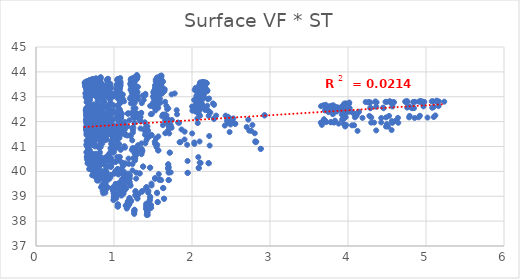
| Category | UTCI |
|---|---|
| 4.486788539 | 41.801 |
| 3.949624654 | 42.354 |
| 3.759180136 | 42.436 |
| 3.742222567 | 42.552 |
| 3.654237098 | 42.621 |
| 3.974717196 | 42.715 |
| 4.263869113 | 42.77 |
| 4.542926614 | 42.775 |
| 4.744093994 | 42.787 |
| 4.940980931 | 42.786 |
| 5.135739082 | 42.8 |
| 2.879706771 | 40.906 |
| 2.552333557 | 41.915 |
| 2.279948675 | 42.115 |
| 2.177338971 | 42.474 |
| 2.061597244 | 42.911 |
| 2.094749023 | 43.022 |
| 2.126837848 | 43.104 |
| 2.15227498 | 43.135 |
| 2.153879629 | 43.232 |
| 2.194003849 | 43.233 |
| 2.19378923 | 43.259 |
| 2.210856108 | 40.328 |
| 2.029364198 | 41.163 |
| 1.73897898 | 41.752 |
| 1.673625694 | 42.249 |
| 1.564835136 | 42.954 |
| 1.572547364 | 43.087 |
| 1.535855934 | 43.181 |
| 1.60111586 | 43.562 |
| 1.582209392 | 43.586 |
| 1.623315371 | 43.605 |
| 1.613406965 | 43.638 |
| 1.942210423 | 39.941 |
| 1.714235102 | 40.753 |
| 1.480953412 | 41.462 |
| 1.4254869 | 41.677 |
| 1.294508838 | 42.173 |
| 1.271420072 | 42.326 |
| 1.253394651 | 42.743 |
| 1.270340444 | 43.111 |
| 1.278923387 | 43.162 |
| 1.283626095 | 43.194 |
| 1.30296399 | 43.397 |
| 1.698177774 | 39.65 |
| 1.462028367 | 40.148 |
| 1.27091445 | 40.839 |
| 1.201809311 | 41.442 |
| 1.10058555 | 41.636 |
| 1.075263798 | 41.829 |
| 1.052933975 | 42.291 |
| 1.078854567 | 42.379 |
| 1.072377857 | 42.444 |
| 1.08537817 | 42.779 |
| 1.080415606 | 43.118 |
| 1.639682546 | 38.899 |
| 1.327794919 | 39.919 |
| 1.141592862 | 40.321 |
| 1.075417488 | 40.58 |
| 0.997992097 | 41.447 |
| 0.946364996 | 41.664 |
| 0.935350475 | 41.808 |
| 0.94243079 | 42.223 |
| 0.942487908 | 42.318 |
| 0.951610133 | 42.383 |
| 0.957651434 | 42.71 |
| 1.55863117 | 38.765 |
| 1.209449999 | 39.451 |
| 1.046748924 | 40.1 |
| 0.995684676 | 40.396 |
| 0.907667708 | 41.278 |
| 0.874918428 | 41.495 |
| 0.845177183 | 41.667 |
| 0.859620747 | 41.762 |
| 0.854211444 | 42.188 |
| 0.855205171 | 42.239 |
| 0.860226385 | 42.303 |
| 1.4701185 | 38.645 |
| 1.150492305 | 39.325 |
| 1.003495515 | 39.914 |
| 0.927974144 | 40.198 |
| 0.859902124 | 40.457 |
| 0.806846385 | 41.036 |
| 0.795131838 | 41.522 |
| 0.789590195 | 41.642 |
| 0.796087293 | 41.741 |
| 0.790709972 | 41.837 |
| 0.799640608 | 42.202 |
| 1.470584202 | 38.536 |
| 1.118441243 | 39.177 |
| 0.949479058 | 39.746 |
| 0.885737589 | 40.015 |
| 0.812335912 | 40.269 |
| 0.74869555 | 40.516 |
| 0.745889614 | 41.062 |
| 0.738537897 | 41.508 |
| 0.744077679 | 41.613 |
| 0.737655734 | 41.707 |
| 0.746270365 | 41.798 |
| 1.42519891 | 38.405 |
| 1.092816643 | 39.055 |
| 0.91536853 | 39.37 |
| 0.855506337 | 39.889 |
| 0.772737936 | 40.124 |
| 0.72681758 | 40.391 |
| 0.708651987 | 40.571 |
| 0.707507181 | 41.369 |
| 0.70383044 | 41.492 |
| 0.6982605 | 41.584 |
| 0.702827981 | 41.675 |
| 1.422681307 | 38.334 |
| 1.046331424 | 38.674 |
| 0.890908404 | 39.249 |
| 0.819866809 | 39.739 |
| 0.751866019 | 39.994 |
| 0.700565779 | 40.232 |
| 0.682326836 | 40.455 |
| 0.679053208 | 40.588 |
| 0.674430372 | 41.375 |
| 0.672207809 | 41.482 |
| 0.674028473 | 41.572 |
| 1.419907324 | 38.247 |
| 1.044553532 | 38.587 |
| 0.889438845 | 39.146 |
| 0.804589099 | 39.629 |
| 0.735897723 | 39.843 |
| 0.681566753 | 40.092 |
| 0.660359029 | 40.321 |
| 0.652663117 | 40.488 |
| 0.650654639 | 40.587 |
| 0.64479603 | 41.068 |
| 0.646346839 | 41.473 |
| 4.568565884 | 41.948 |
| 4.140984143 | 42.397 |
| 3.951257644 | 42.508 |
| 3.863094755 | 42.576 |
| 3.92836058 | 42.635 |
| 3.975672008 | 42.716 |
| 4.357384298 | 42.768 |
| 4.590170348 | 42.78 |
| 4.834905093 | 42.79 |
| 4.978555975 | 42.791 |
| 5.234250516 | 42.802 |
| 2.823903527 | 41.188 |
| 2.494266268 | 41.885 |
| 2.223392308 | 42.396 |
| 2.133300163 | 42.662 |
| 2.08761835 | 43.052 |
| 2.060211047 | 43.035 |
| 2.098200008 | 43.461 |
| 2.133390441 | 43.497 |
| 2.136926267 | 43.513 |
| 2.16177453 | 43.521 |
| 2.172496844 | 43.545 |
| 2.110966983 | 40.34 |
| 1.851264698 | 41.174 |
| 1.69276654 | 42.086 |
| 1.625501071 | 42.274 |
| 1.563154578 | 42.68 |
| 1.519896174 | 43.098 |
| 1.531501775 | 43.359 |
| 1.568305052 | 43.41 |
| 1.592444457 | 43.597 |
| 1.596414871 | 43.621 |
| 1.615301887 | 43.643 |
| 1.726968067 | 39.96 |
| 1.570120589 | 40.841 |
| 1.397507061 | 41.474 |
| 1.337292328 | 42.02 |
| 1.280268519 | 42.2 |
| 1.228640717 | 42.35 |
| 1.229067227 | 42.751 |
| 1.241658919 | 43.114 |
| 1.261871118 | 43.17 |
| 1.258357699 | 43.367 |
| 1.284956586 | 43.401 |
| 1.605386565 | 39.649 |
| 1.374324453 | 40.188 |
| 1.228672293 | 40.866 |
| 1.150817173 | 41.471 |
| 1.110639825 | 41.679 |
| 1.04946705 | 42.147 |
| 1.04817008 | 42.301 |
| 1.062960038 | 42.398 |
| 1.071685389 | 42.733 |
| 1.072417287 | 43.085 |
| 1.079581495 | 43.136 |
| 1.43789417 | 39.145 |
| 1.285693402 | 39.947 |
| 1.103919447 | 40.329 |
| 1.023459191 | 41.274 |
| 0.992571992 | 41.482 |
| 0.920358685 | 41.686 |
| 0.924444893 | 41.832 |
| 0.920446597 | 42.239 |
| 0.93499502 | 42.327 |
| 0.933088916 | 42.399 |
| 0.94913168 | 42.72 |
| 1.301296136 | 39.038 |
| 1.126944807 | 39.991 |
| 1.016885737 | 40.379 |
| 0.934808721 | 40.681 |
| 0.897109835 | 41.594 |
| 0.840205139 | 41.78 |
| 0.836574405 | 41.959 |
| 0.833480858 | 42.36 |
| 0.844733901 | 42.46 |
| 0.836333877 | 42.519 |
| 0.852197248 | 42.605 |
| 1.299932386 | 38.906 |
| 1.099698081 | 39.582 |
| 0.958620356 | 40.195 |
| 0.887012653 | 40.5 |
| 0.85049672 | 41.117 |
| 0.782081688 | 41.335 |
| 0.784620905 | 41.808 |
| 0.768010044 | 41.928 |
| 0.787885724 | 42.032 |
| 0.775012112 | 42.427 |
| 0.791110925 | 42.495 |
| 1.216596783 | 38.804 |
| 1.072606 | 39.436 |
| 0.911021567 | 39.756 |
| 0.85100343 | 40.31 |
| 0.803995514 | 40.595 |
| 0.739806421 | 41.162 |
| 0.739887353 | 41.361 |
| 0.729963395 | 41.791 |
| 0.739078206 | 41.89 |
| 0.733108039 | 41.994 |
| 0.741933057 | 42.091 |
| 1.192847794 | 38.681 |
| 1.034547222 | 39.056 |
| 0.885436112 | 39.596 |
| 0.807866346 | 40.187 |
| 0.780377973 | 40.439 |
| 0.707279935 | 40.664 |
| 0.707602419 | 41.221 |
| 0.694819785 | 41.661 |
| 0.701880716 | 41.773 |
| 0.694781085 | 41.877 |
| 0.704588817 | 41.974 |
| 1.178879667 | 38.605 |
| 0.9966227 | 38.942 |
| 0.864012081 | 39.472 |
| 0.791393328 | 40.037 |
| 0.756858921 | 40.297 |
| 0.689126227 | 40.518 |
| 0.678822456 | 40.727 |
| 0.667479713 | 40.874 |
| 0.671936342 | 41.66 |
| 0.667517162 | 41.768 |
| 0.672772356 | 41.874 |
| 1.163297432 | 38.505 |
| 0.991924402 | 38.845 |
| 0.844136305 | 39.38 |
| 0.772680061 | 39.916 |
| 0.732469704 | 40.168 |
| 0.665948811 | 40.366 |
| 0.656651714 | 40.599 |
| 0.646180819 | 40.763 |
| 0.648423331 | 41.234 |
| 0.641929459 | 41.659 |
| 0.643663169 | 41.762 |
| 4.334167833 | 41.962 |
| 4.088981611 | 42.174 |
| 3.839176386 | 42.522 |
| 3.750908166 | 42.381 |
| 3.812900498 | 42.655 |
| 3.952248714 | 42.726 |
| 4.226309921 | 42.787 |
| 4.496298362 | 42.792 |
| 4.733871726 | 42.803 |
| 4.914619919 | 42.805 |
| 5.07323341 | 42.815 |
| 2.804915347 | 41.531 |
| 2.457060372 | 41.976 |
| 2.27697354 | 42.713 |
| 2.123249963 | 42.971 |
| 2.093839693 | 43.244 |
| 2.09248676 | 43.341 |
| 2.096968671 | 43.494 |
| 2.155295311 | 43.517 |
| 2.155420455 | 43.533 |
| 2.186201903 | 43.545 |
| 2.176563232 | 43.569 |
| 2.084443954 | 40.141 |
| 1.906263649 | 41.595 |
| 1.726687763 | 41.862 |
| 1.657175268 | 42.054 |
| 1.560880592 | 42.767 |
| 1.550719953 | 42.871 |
| 1.541393061 | 43.137 |
| 1.587143675 | 43.338 |
| 1.614314925 | 43.366 |
| 1.602933173 | 43.383 |
| 1.607141172 | 43.482 |
| 1.694931019 | 40.286 |
| 1.524894866 | 41.111 |
| 1.428590405 | 41.81 |
| 1.347970966 | 42.347 |
| 1.275890454 | 42.537 |
| 1.242623511 | 42.97 |
| 1.231375082 | 43.374 |
| 1.252636726 | 43.588 |
| 1.269865016 | 43.648 |
| 1.273066627 | 43.69 |
| 1.293620412 | 43.714 |
| 1.526039393 | 39.702 |
| 1.358705123 | 40.81 |
| 1.242169898 | 41.56 |
| 1.166178348 | 41.809 |
| 1.102118794 | 42.312 |
| 1.05598475 | 42.487 |
| 1.040386512 | 42.631 |
| 1.06758911 | 43.302 |
| 1.074224069 | 43.363 |
| 1.071277823 | 43.401 |
| 1.083064833 | 43.613 |
| 1.481829164 | 39.431 |
| 1.237078429 | 40.292 |
| 1.142213202 | 40.956 |
| 1.026915949 | 41.61 |
| 1.003493403 | 41.827 |
| 0.925847744 | 42.321 |
| 0.938169316 | 42.483 |
| 0.922478139 | 42.572 |
| 0.934407789 | 42.646 |
| 0.934592263 | 43.023 |
| 0.957231549 | 43.355 |
| 1.413353609 | 39.301 |
| 1.138222679 | 39.8 |
| 1.070738208 | 40.433 |
| 0.957307134 | 40.777 |
| 0.916056967 | 41.662 |
| 0.865359981 | 42.171 |
| 0.848137091 | 42.032 |
| 0.856355194 | 42.435 |
| 0.852054575 | 42.532 |
| 0.853728425 | 42.595 |
| 0.86821733 | 42.659 |
| 1.357551026 | 39.176 |
| 1.103368646 | 39.903 |
| 1.024503149 | 39.999 |
| 0.900406699 | 40.573 |
| 0.880290428 | 41.495 |
| 0.801954194 | 41.713 |
| 0.796576883 | 41.898 |
| 0.789835199 | 42.301 |
| 0.796134453 | 42.41 |
| 0.793672452 | 42.505 |
| 0.804287358 | 42.565 |
| 1.307206942 | 39.07 |
| 1.06884836 | 39.46 |
| 0.962689607 | 39.838 |
| 0.853005522 | 40.377 |
| 0.829119731 | 40.978 |
| 0.741542509 | 41.253 |
| 0.743493673 | 41.745 |
| 0.737922444 | 41.876 |
| 0.740542093 | 42.277 |
| 0.742027363 | 42.374 |
| 0.752166628 | 42.482 |
| 1.262807874 | 38.455 |
| 1.022385499 | 39.347 |
| 0.930858561 | 39.673 |
| 0.822914565 | 40.279 |
| 0.795722168 | 40.519 |
| 0.718964895 | 41.066 |
| 0.71320036 | 41.319 |
| 0.711544136 | 41.749 |
| 0.699479757 | 41.855 |
| 0.710435086 | 41.949 |
| 0.712502063 | 42.358 |
| 1.259869452 | 38.386 |
| 1.000616629 | 38.987 |
| 0.892370325 | 39.534 |
| 0.796455356 | 40.136 |
| 0.767330641 | 40.368 |
| 0.693825913 | 40.6 |
| 0.681295255 | 40.836 |
| 0.684510391 | 41.62 |
| 0.673049024 | 41.757 |
| 0.681332301 | 41.852 |
| 0.673074524 | 42.255 |
| 1.259188853 | 38.29 |
| 0.999519667 | 38.889 |
| 0.89186486 | 39.42 |
| 0.772696752 | 39.737 |
| 0.751255227 | 40.263 |
| 0.67968699 | 40.46 |
| 0.660994667 | 40.703 |
| 0.663582192 | 40.858 |
| 0.64916127 | 41.622 |
| 0.656569159 | 41.753 |
| 0.653020289 | 41.861 |
| 4.608128576 | 42.032 |
| 4.109561613 | 42.239 |
| 3.96469232 | 42.333 |
| 3.853913091 | 42.405 |
| 3.872981029 | 42.465 |
| 4.021515277 | 42.544 |
| 4.362162656 | 42.596 |
| 4.569880995 | 42.607 |
| 4.787368512 | 42.611 |
| 4.967397376 | 42.611 |
| 5.16124365 | 42.623 |
| 2.733732505 | 41.637 |
| 2.472537371 | 42.156 |
| 2.219369132 | 42.93 |
| 2.125417118 | 42.973 |
| 2.045947281 | 43.355 |
| 2.070762676 | 43.174 |
| 2.106093762 | 43.53 |
| 2.124507739 | 43.555 |
| 2.107547509 | 43.573 |
| 2.16159416 | 43.58 |
| 2.140999358 | 43.598 |
| 2.097186396 | 41.201 |
| 1.834269129 | 41.951 |
| 1.696047168 | 42.531 |
| 1.618260706 | 43.14 |
| 1.541123293 | 43.265 |
| 1.524892814 | 43.456 |
| 1.535594373 | 43.698 |
| 1.56194792 | 43.736 |
| 1.570400317 | 43.758 |
| 1.590473316 | 43.775 |
| 1.59056003 | 43.793 |
| 1.702923655 | 40.169 |
| 1.553900913 | 41.068 |
| 1.394963082 | 41.973 |
| 1.32969695 | 42.201 |
| 1.256127478 | 42.801 |
| 1.231796821 | 43.25 |
| 1.236456155 | 43.36 |
| 1.237566137 | 43.415 |
| 1.244956534 | 43.454 |
| 1.256680385 | 43.548 |
| 1.273676402 | 43.73 |
| 1.574114136 | 39.892 |
| 1.360207631 | 40.79 |
| 1.232460953 | 41.749 |
| 1.139092329 | 41.984 |
| 1.092409472 | 42.186 |
| 1.052977994 | 42.627 |
| 1.042960913 | 43.043 |
| 1.058655927 | 43.306 |
| 1.057744805 | 43.345 |
| 1.06952773 | 43.388 |
| 1.06865504 | 43.424 |
| 1.415505908 | 39.363 |
| 1.272576477 | 40.528 |
| 1.085417068 | 40.863 |
| 1.012890638 | 41.811 |
| 0.971837987 | 42.003 |
| 0.923557113 | 42.219 |
| 0.930290143 | 42.338 |
| 0.917283213 | 42.998 |
| 0.923931622 | 43.24 |
| 0.930592364 | 43.308 |
| 0.938680858 | 43.333 |
| 1.273424569 | 39.19 |
| 1.114541993 | 40.229 |
| 1.005316111 | 40.913 |
| 0.926224869 | 41.586 |
| 0.883156691 | 42.127 |
| 0.842804894 | 42.325 |
| 0.837129122 | 42.49 |
| 0.831068186 | 42.569 |
| 0.837228755 | 42.649 |
| 0.834562505 | 43.143 |
| 0.843562437 | 43.508 |
| 1.272682969 | 39.032 |
| 1.091546891 | 40.065 |
| 0.95441378 | 40.424 |
| 0.879060336 | 41.412 |
| 0.838699263 | 41.659 |
| 0.784551603 | 41.874 |
| 0.781110995 | 42.346 |
| 0.766048795 | 42.457 |
| 0.78032349 | 42.547 |
| 0.772216083 | 42.625 |
| 0.78202924 | 42.958 |
| 1.19858677 | 38.918 |
| 1.05963104 | 39.907 |
| 0.901441348 | 40 |
| 0.840500065 | 40.56 |
| 0.799934542 | 41.504 |
| 0.741956276 | 41.73 |
| 0.72991975 | 42.216 |
| 0.728460452 | 42.345 |
| 0.73210969 | 42.435 |
| 0.732267975 | 42.528 |
| 0.732319585 | 42.607 |
| 1.178277876 | 38.795 |
| 1.02477149 | 39.487 |
| 0.87462619 | 39.856 |
| 0.799754166 | 40.426 |
| 0.771116348 | 40.708 |
| 0.710400958 | 41.606 |
| 0.695843438 | 41.782 |
| 0.693748307 | 42.223 |
| 0.696177404 | 42.328 |
| 0.695393903 | 42.424 |
| 0.696047381 | 42.514 |
| 1.185437091 | 38.722 |
| 0.987614537 | 39.35 |
| 0.860839984 | 39.722 |
| 0.78398726 | 40.289 |
| 0.745069147 | 40.548 |
| 0.687335543 | 41.168 |
| 0.672935097 | 41.666 |
| 0.666607747 | 42.11 |
| 0.665721925 | 42.228 |
| 0.666876036 | 42.331 |
| 0.667283325 | 42.419 |
| 1.150791683 | 38.63 |
| 0.986623319 | 39.233 |
| 0.835473753 | 39.361 |
| 0.762789822 | 40.18 |
| 0.726723335 | 40.409 |
| 0.668951353 | 41.017 |
| 0.648694278 | 41.543 |
| 0.645446678 | 41.704 |
| 0.643241963 | 42.108 |
| 0.641993535 | 42.226 |
| 0.639724666 | 42.325 |
| 4.561616843 | 42.021 |
| 4.078922355 | 41.854 |
| 3.920269004 | 42.279 |
| 3.820321569 | 41.96 |
| 3.801522854 | 42.429 |
| 3.935943484 | 42.481 |
| 4.287146993 | 42.537 |
| 4.456382292 | 42.539 |
| 4.818934165 | 42.54 |
| 4.846150742 | 42.541 |
| 5.079624296 | 42.558 |
| 2.930105002 | 42.246 |
| 2.530042258 | 42.128 |
| 2.309796412 | 42.243 |
| 2.152113253 | 43.008 |
| 2.087685104 | 43.16 |
| 2.082522812 | 43.231 |
| 2.140902809 | 43.306 |
| 2.124124832 | 43.325 |
| 2.161343667 | 43.341 |
| 2.159590363 | 43.337 |
| 2.170927077 | 43.357 |
| 2.226222748 | 41.037 |
| 2.00535651 | 42.44 |
| 1.778301586 | 43.132 |
| 1.650482579 | 43.302 |
| 1.559940552 | 43.411 |
| 1.563925634 | 43.541 |
| 1.552400452 | 43.776 |
| 1.582051118 | 43.81 |
| 1.607073751 | 43.834 |
| 1.599797652 | 43.835 |
| 1.60766715 | 43.855 |
| 1.943232901 | 40.417 |
| 1.689272227 | 41.894 |
| 1.472248898 | 42.3 |
| 1.40322178 | 43.118 |
| 1.284809192 | 43.288 |
| 1.262772836 | 43.435 |
| 1.262002955 | 43.548 |
| 1.257376379 | 43.747 |
| 1.296552736 | 43.772 |
| 1.26602008 | 43.786 |
| 1.302834571 | 43.808 |
| 1.692851319 | 40.137 |
| 1.437909542 | 41.63 |
| 1.261960018 | 41.946 |
| 1.179654639 | 42.315 |
| 1.090430956 | 43.13 |
| 1.067921924 | 43.31 |
| 1.055233538 | 43.438 |
| 1.066359875 | 43.506 |
| 1.084457676 | 43.537 |
| 1.069720573 | 43.563 |
| 1.0796783 | 43.753 |
| 1.633753308 | 39.323 |
| 1.306638762 | 41.051 |
| 1.135644438 | 41.777 |
| 1.054568597 | 42.005 |
| 0.984843543 | 42.357 |
| 0.942911873 | 43.212 |
| 0.936921396 | 43.318 |
| 0.932445853 | 43.402 |
| 0.943068256 | 43.463 |
| 0.939176427 | 43.501 |
| 0.95318178 | 43.519 |
| 1.551715013 | 39.143 |
| 1.189948346 | 40.299 |
| 1.041914995 | 41.591 |
| 0.976240434 | 41.86 |
| 0.900909677 | 42.116 |
| 0.870121143 | 42.807 |
| 0.844754261 | 43.251 |
| 0.851396129 | 43.296 |
| 0.863107238 | 43.373 |
| 0.84304798 | 43.404 |
| 0.856437852 | 43.45 |
| 1.464033907 | 38.979 |
| 1.131751809 | 39.822 |
| 1.010103132 | 41.41 |
| 0.909942194 | 41.71 |
| 0.845287629 | 41.948 |
| 0.803598611 | 42.399 |
| 0.791276341 | 42.57 |
| 0.782666763 | 43.231 |
| 0.797624695 | 43.286 |
| 0.778425975 | 43.342 |
| 0.790656568 | 43.378 |
| 1.459939143 | 38.855 |
| 1.099405145 | 39.364 |
| 0.955109739 | 40.929 |
| 0.86700852 | 41.538 |
| 0.808765881 | 41.84 |
| 0.746162555 | 42.114 |
| 0.74555274 | 42.453 |
| 0.731217927 | 42.567 |
| 0.741286884 | 43.206 |
| 0.726928317 | 43.263 |
| 0.731671136 | 43.319 |
| 1.414760538 | 38.704 |
| 1.074964326 | 39.212 |
| 0.912084962 | 39.894 |
| 0.837792165 | 41.426 |
| 0.767502903 | 41.711 |
| 0.724518595 | 42.02 |
| 0.706755354 | 42.2 |
| 0.701460349 | 42.467 |
| 0.706961651 | 42.55 |
| 0.69010922 | 42.896 |
| 0.69824161 | 43.247 |
| 1.416322104 | 38.613 |
| 1.030721913 | 39.059 |
| 0.887515722 | 39.451 |
| 0.803302596 | 40.962 |
| 0.739297089 | 41.551 |
| 0.698242978 | 41.895 |
| 0.680377294 | 42.104 |
| 0.674506343 | 42.377 |
| 0.680053251 | 42.477 |
| 0.664832778 | 42.551 |
| 0.667046548 | 42.901 |
| 1.414905497 | 38.501 |
| 1.029767401 | 38.943 |
| 0.882191675 | 39.346 |
| 0.787992223 | 40.203 |
| 0.729802585 | 41.454 |
| 0.67933878 | 41.771 |
| 0.658395364 | 41.994 |
| 0.649095873 | 42.298 |
| 0.656455781 | 42.366 |
| 0.638405513 | 42.46 |
| 0.644712327 | 42.546 |
| 4.5594269 | 41.661 |
| 4.051515882 | 41.851 |
| 3.87928899 | 41.919 |
| 3.77816739 | 41.981 |
| 3.833483357 | 42.038 |
| 3.948959208 | 42.123 |
| 4.29830697 | 42.17 |
| 4.488327405 | 42.17 |
| 4.78317748 | 42.17 |
| 4.905511965 | 42.173 |
| 5.100381688 | 42.185 |
| 2.774452367 | 41.864 |
| 2.447859297 | 42.043 |
| 2.210278814 | 42.437 |
| 2.103419214 | 42.237 |
| 2.034575812 | 42.602 |
| 2.04223634 | 42.426 |
| 2.062472228 | 42.763 |
| 2.091116953 | 42.778 |
| 2.099547738 | 42.791 |
| 2.115892532 | 42.786 |
| 2.122222463 | 42.797 |
| 2.073952582 | 41.941 |
| 1.808021536 | 42.294 |
| 1.670899301 | 42.639 |
| 1.596596365 | 42.763 |
| 1.518015137 | 42.863 |
| 1.50517951 | 42.962 |
| 1.506283028 | 43.027 |
| 1.53590221 | 43.058 |
| 1.561290427 | 43.065 |
| 1.565270128 | 43.068 |
| 1.5757519 | 43.076 |
| 1.690980577 | 41.635 |
| 1.534450947 | 42.647 |
| 1.380882539 | 42.868 |
| 1.305084402 | 43.021 |
| 1.240522802 | 43.156 |
| 1.215340565 | 43.435 |
| 1.207760991 | 43.519 |
| 1.217135683 | 43.554 |
| 1.234991715 | 43.565 |
| 1.226983171 | 43.571 |
| 1.257068371 | 43.592 |
| 1.568960137 | 41.404 |
| 1.34061408 | 42.189 |
| 1.216643481 | 42.736 |
| 1.114909978 | 42.906 |
| 1.071023759 | 43.05 |
| 1.035418729 | 43.184 |
| 1.029289742 | 43.29 |
| 1.040413593 | 43.506 |
| 1.050899336 | 43.514 |
| 1.049941693 | 43.533 |
| 1.053650708 | 43.55 |
| 1.402361327 | 41.13 |
| 1.248227706 | 41.757 |
| 1.074852808 | 42.812 |
| 0.990341966 | 43.021 |
| 0.958077396 | 43.17 |
| 0.909408248 | 43.336 |
| 0.906366903 | 43.427 |
| 0.902445335 | 43.484 |
| 0.917496578 | 43.679 |
| 0.914391365 | 43.711 |
| 0.924852399 | 43.721 |
| 1.264679141 | 40.931 |
| 1.093219502 | 41.751 |
| 0.993989865 | 42.658 |
| 0.904470317 | 43.175 |
| 0.866386755 | 43.364 |
| 0.82856236 | 43.52 |
| 0.819248451 | 43.639 |
| 0.81673842 | 43.688 |
| 0.827048871 | 43.728 |
| 0.818215054 | 43.745 |
| 0.830485246 | 43.789 |
| 1.261981097 | 40.735 |
| 1.070427781 | 41.346 |
| 0.935876599 | 42.524 |
| 0.857807444 | 43.068 |
| 0.819709386 | 43.257 |
| 0.771155664 | 43.434 |
| 0.770331473 | 43.569 |
| 0.752806763 | 43.639 |
| 0.771114089 | 43.676 |
| 0.757157772 | 43.72 |
| 0.769705975 | 43.743 |
| 1.182524931 | 39.908 |
| 1.038885844 | 41.205 |
| 0.885690799 | 41.836 |
| 0.821447313 | 42.915 |
| 0.778999498 | 43.172 |
| 0.731001548 | 43.343 |
| 0.726488418 | 43.489 |
| 0.714426677 | 43.576 |
| 0.721561464 | 43.62 |
| 0.716706488 | 43.669 |
| 0.7208901 | 43.715 |
| 1.159704846 | 39.702 |
| 1.000738882 | 41.049 |
| 0.863056398 | 41.703 |
| 0.779822019 | 42.262 |
| 0.752994829 | 43.072 |
| 0.698344651 | 43.279 |
| 0.696048602 | 43.425 |
| 0.679600444 | 43.519 |
| 0.688476736 | 43.571 |
| 0.676272627 | 43.621 |
| 0.684270677 | 43.669 |
| 1.157326725 | 39.558 |
| 0.964777875 | 40.532 |
| 0.844947773 | 41.588 |
| 0.764450991 | 42.149 |
| 0.72709724 | 42.38 |
| 0.677015715 | 43.19 |
| 0.666736727 | 43.362 |
| 0.654562234 | 43.454 |
| 0.657251784 | 43.535 |
| 0.647278847 | 43.578 |
| 0.653994944 | 43.628 |
| 1.132492425 | 39.41 |
| 0.963748416 | 40.388 |
| 0.824218121 | 41.216 |
| 0.746920046 | 42.051 |
| 0.707949537 | 42.287 |
| 0.657392182 | 42.809 |
| 0.64494821 | 43.288 |
| 0.632780349 | 43.403 |
| 0.634522074 | 43.449 |
| 0.62746486 | 43.535 |
| 0.628493795 | 43.585 |
| 4.122384804 | 41.628 |
| 3.976448594 | 41.867 |
| 3.665498744 | 41.869 |
| 3.650776108 | 41.959 |
| 3.679685345 | 42.01 |
| 3.924085846 | 42.083 |
| 4.185943142 | 42.15 |
| 4.426181435 | 42.146 |
| 4.64034501 | 42.151 |
| 4.854260306 | 42.147 |
| 5.01911834 | 42.163 |
| 2.700882052 | 41.783 |
| 2.420280297 | 41.841 |
| 2.213090102 | 42.234 |
| 2.083290016 | 42.317 |
| 2.044650895 | 42.41 |
| 2.068923498 | 42.489 |
| 2.064530672 | 42.568 |
| 2.112276148 | 42.569 |
| 2.095910484 | 42.594 |
| 2.141032697 | 42.587 |
| 2.1248697 | 42.592 |
| 2.002211006 | 41.525 |
| 1.865614865 | 41.684 |
| 1.651841197 | 42.288 |
| 1.616954251 | 42.215 |
| 1.503960956 | 42.599 |
| 1.531448215 | 42.449 |
| 1.497315212 | 42.746 |
| 1.551680988 | 42.557 |
| 1.542939268 | 42.769 |
| 1.567426344 | 42.555 |
| 1.557256672 | 42.778 |
| 1.627111477 | 41.859 |
| 1.485103864 | 42.305 |
| 1.356684734 | 42.742 |
| 1.310519136 | 42.899 |
| 1.220733076 | 43.009 |
| 1.227209321 | 43.178 |
| 1.211947596 | 43.282 |
| 1.224441294 | 43.29 |
| 1.225264917 | 43.296 |
| 1.237787411 | 43.304 |
| 1.252579374 | 43.325 |
| 1.459893423 | 41.417 |
| 1.317317793 | 42.185 |
| 1.185094308 | 42.336 |
| 1.129520024 | 42.816 |
| 1.047597747 | 42.933 |
| 1.041630856 | 43.037 |
| 1.021799323 | 43.151 |
| 1.041920017 | 43.274 |
| 1.035898891 | 43.276 |
| 1.044402086 | 43.278 |
| 1.045821779 | 43.291 |
| 1.415924743 | 41.26 |
| 1.198207076 | 42.057 |
| 1.08797342 | 42.259 |
| 0.991817546 | 42.448 |
| 0.94969087 | 42.879 |
| 0.914023178 | 43.016 |
| 0.917637812 | 43.109 |
| 0.900440408 | 43.139 |
| 0.918080697 | 43.161 |
| 0.910988551 | 43.197 |
| 0.926319898 | 43.281 |
| 1.352788027 | 41.126 |
| 1.100661424 | 41.934 |
| 1.020798318 | 42.148 |
| 0.924432486 | 42.386 |
| 0.868144745 | 42.845 |
| 0.853118448 | 42.985 |
| 0.837065328 | 43.09 |
| 0.834957917 | 43.098 |
| 0.830918838 | 43.128 |
| 0.830729997 | 43.146 |
| 0.838232034 | 43.25 |
| 1.299570906 | 40.982 |
| 1.066296956 | 41.835 |
| 0.974942822 | 42.062 |
| 0.868559844 | 42.306 |
| 0.828574152 | 42.462 |
| 0.790945096 | 42.934 |
| 0.788770472 | 43.063 |
| 0.770731868 | 43.084 |
| 0.780490027 | 43.101 |
| 0.771204837 | 43.134 |
| 0.776613768 | 43.224 |
| 1.246987257 | 40.531 |
| 1.0301943 | 41.464 |
| 0.910130433 | 41.969 |
| 0.82078434 | 42.21 |
| 0.777034952 | 42.393 |
| 0.731683803 | 42.544 |
| 0.736331754 | 42.69 |
| 0.718967241 | 43.046 |
| 0.727956522 | 43.073 |
| 0.721252397 | 43.106 |
| 0.725863955 | 43.221 |
| 1.204539757 | 39.839 |
| 0.985350508 | 41.34 |
| 0.885138123 | 41.875 |
| 0.791811037 | 42.169 |
| 0.749888352 | 42.335 |
| 0.709962418 | 42.522 |
| 0.703642047 | 42.652 |
| 0.694033609 | 43.021 |
| 0.691516894 | 43.035 |
| 0.687755493 | 43.078 |
| 0.687897058 | 43.19 |
| 1.203084046 | 39.718 |
| 0.965117903 | 41.21 |
| 0.849957513 | 41.527 |
| 0.76625681 | 42.094 |
| 0.717775638 | 42.256 |
| 0.685214866 | 42.453 |
| 0.672342769 | 42.618 |
| 0.668015197 | 42.82 |
| 0.658532139 | 43.027 |
| 0.660391096 | 43.054 |
| 0.656319091 | 43.164 |
| 1.20186443 | 39.565 |
| 0.964091368 | 41.1 |
| 0.849382038 | 41.469 |
| 0.743821456 | 41.756 |
| 0.702683064 | 42.207 |
| 0.671554791 | 42.382 |
| 0.654257589 | 42.571 |
| 0.648316993 | 42.784 |
| 0.638542913 | 42.973 |
| 0.638206847 | 43.029 |
| 0.632260013 | 43.139 |
| 4.361652191 | 41.646 |
| 3.946325494 | 41.902 |
| 3.781280654 | 41.975 |
| 3.708237248 | 42.038 |
| 3.692078302 | 42.096 |
| 3.970680072 | 42.18 |
| 4.273670901 | 42.231 |
| 4.526528338 | 42.23 |
| 4.79005785 | 42.23 |
| 4.921865904 | 42.235 |
| 5.120415466 | 42.249 |
| 2.721517642 | 42.079 |
| 2.430794623 | 42.24 |
| 2.195566593 | 42.636 |
| 2.095433834 | 42.44 |
| 2.027469597 | 42.87 |
| 2.049355071 | 42.696 |
| 2.057620543 | 43.039 |
| 2.092563524 | 43.051 |
| 2.094935543 | 43.064 |
| 2.118566687 | 43.06 |
| 2.11640031 | 43.069 |
| 2.068004034 | 42.124 |
| 1.803944937 | 42.461 |
| 1.655613421 | 42.8 |
| 1.589186704 | 42.921 |
| 1.503420099 | 43.022 |
| 1.510169001 | 43.116 |
| 1.503816479 | 43.185 |
| 1.535929007 | 43.284 |
| 1.55625939 | 43.29 |
| 1.559067698 | 43.292 |
| 1.570209404 | 43.298 |
| 1.657108167 | 41.534 |
| 1.523733382 | 42.836 |
| 1.369096263 | 43.047 |
| 1.302070537 | 43.185 |
| 1.220524171 | 43.314 |
| 1.219992075 | 43.595 |
| 1.213847877 | 43.686 |
| 1.216936111 | 43.716 |
| 1.230735878 | 43.724 |
| 1.227112546 | 43.729 |
| 1.246876179 | 43.75 |
| 1.538310319 | 41.32 |
| 1.331111271 | 42.068 |
| 1.203090436 | 42.931 |
| 1.114068839 | 43.089 |
| 1.052126002 | 43.222 |
| 1.042278763 | 43.345 |
| 1.031069017 | 43.454 |
| 1.041100684 | 43.673 |
| 1.047251937 | 43.679 |
| 1.045430045 | 43.697 |
| 1.047515539 | 43.71 |
| 1.36332492 | 40.834 |
| 1.243214961 | 41.656 |
| 1.07091396 | 42.501 |
| 0.988910357 | 43.011 |
| 0.93618765 | 43.148 |
| 0.91336512 | 43.303 |
| 0.90776601 | 43.389 |
| 0.902684243 | 43.437 |
| 0.914863827 | 43.639 |
| 0.910170765 | 43.668 |
| 0.919431663 | 43.676 |
| 1.284505036 | 40.655 |
| 1.085472811 | 41.485 |
| 0.985864736 | 42.356 |
| 0.903178789 | 43.185 |
| 0.846289737 | 43.374 |
| 0.832503925 | 43.516 |
| 0.824580202 | 43.632 |
| 0.816996517 | 43.663 |
| 0.824984414 | 43.702 |
| 0.814745282 | 43.716 |
| 0.824918063 | 43.756 |
| 1.269775038 | 40.454 |
| 1.066129872 | 41.099 |
| 0.928857671 | 42.233 |
| 0.856624298 | 43.086 |
| 0.800956136 | 43.267 |
| 0.777046668 | 43.442 |
| 0.77276754 | 43.574 |
| 0.752428405 | 43.622 |
| 0.770579985 | 43.657 |
| 0.754114684 | 43.695 |
| 0.764714575 | 43.714 |
| 1.188785766 | 39.612 |
| 1.035039951 | 40.953 |
| 0.881128923 | 41.575 |
| 0.820053139 | 42.636 |
| 0.756412132 | 43.189 |
| 0.735400302 | 43.355 |
| 0.724712154 | 43.5 |
| 0.714073508 | 43.567 |
| 0.721507914 | 43.606 |
| 0.713758589 | 43.65 |
| 0.717921802 | 43.693 |
| 1.135694395 | 39.395 |
| 0.998787222 | 40.788 |
| 0.856994189 | 41.447 |
| 0.778789707 | 41.988 |
| 0.731074668 | 43.095 |
| 0.704607945 | 43.294 |
| 0.694591665 | 43.439 |
| 0.680745432 | 43.516 |
| 0.688119545 | 43.561 |
| 0.676063353 | 43.602 |
| 0.681559808 | 43.65 |
| 1.134278057 | 39.253 |
| 0.963040164 | 40.325 |
| 0.84115626 | 41.328 |
| 0.763170257 | 41.882 |
| 0.707719281 | 42.107 |
| 0.683204584 | 42.901 |
| 0.665840409 | 43.375 |
| 0.654345019 | 43.448 |
| 0.657229487 | 43.521 |
| 0.649137406 | 43.564 |
| 0.652303544 | 43.61 |
| 1.120555986 | 39.101 |
| 0.960239244 | 40.178 |
| 0.817886557 | 40.974 |
| 0.743882433 | 41.796 |
| 0.684026746 | 42.016 |
| 0.663949024 | 42.509 |
| 0.644317235 | 43.304 |
| 0.634117994 | 43.4 |
| 0.633041558 | 43.443 |
| 0.626689627 | 43.519 |
| 0.624412506 | 43.568 |
| 4.426056585 | 41.967 |
| 3.963084677 | 41.805 |
| 3.806335469 | 42.3 |
| 3.720380466 | 41.981 |
| 3.704787515 | 42.447 |
| 3.967722634 | 42.511 |
| 4.287680803 | 42.561 |
| 4.449569812 | 42.564 |
| 4.758170418 | 42.564 |
| 4.836030622 | 42.569 |
| 5.097759258 | 42.584 |
| 2.930801745 | 42.259 |
| 2.517906205 | 42.069 |
| 2.268474357 | 42.732 |
| 2.14753557 | 42.945 |
| 2.08644372 | 43.089 |
| 2.092009121 | 43.179 |
| 2.139161012 | 43.239 |
| 2.123260485 | 43.335 |
| 2.140926043 | 43.35 |
| 2.158900303 | 43.347 |
| 2.168061249 | 43.366 |
| 2.220690194 | 41.421 |
| 2.000706073 | 42.605 |
| 1.738319773 | 43.095 |
| 1.646276453 | 43.224 |
| 1.55397588 | 43.325 |
| 1.57005795 | 43.468 |
| 1.553769915 | 43.702 |
| 1.581398435 | 43.736 |
| 1.594072949 | 43.76 |
| 1.595845912 | 43.757 |
| 1.606213019 | 43.776 |
| 1.938194148 | 41.068 |
| 1.682018717 | 42.078 |
| 1.463405654 | 42.632 |
| 1.40115072 | 43.058 |
| 1.269644007 | 43.216 |
| 1.267360526 | 43.369 |
| 1.263426469 | 43.469 |
| 1.256651284 | 43.676 |
| 1.28322856 | 43.7 |
| 1.265634734 | 43.714 |
| 1.292027963 | 43.74 |
| 1.694502075 | 40.102 |
| 1.432013739 | 41.345 |
| 1.252794869 | 42.153 |
| 1.176203315 | 42.327 |
| 1.073645462 | 43.07 |
| 1.072625959 | 43.257 |
| 1.054634533 | 43.376 |
| 1.067562377 | 43.433 |
| 1.074708428 | 43.459 |
| 1.068607622 | 43.489 |
| 1.071360977 | 43.514 |
| 1.628360581 | 39.333 |
| 1.302808077 | 40.793 |
| 1.124995213 | 41.508 |
| 1.052191113 | 41.724 |
| 0.963504598 | 42.367 |
| 0.945447904 | 43.166 |
| 0.935952758 | 43.269 |
| 0.934596113 | 43.339 |
| 0.937326163 | 43.395 |
| 0.938745425 | 43.431 |
| 0.945884572 | 43.448 |
| 1.552303221 | 39.128 |
| 1.186564437 | 40.515 |
| 1.030712483 | 41.308 |
| 0.973145029 | 41.587 |
| 0.879492406 | 41.954 |
| 0.87492727 | 42.772 |
| 0.842928219 | 42.918 |
| 0.852239825 | 43.244 |
| 0.853065171 | 43.313 |
| 0.841682228 | 43.343 |
| 0.850978457 | 43.379 |
| 1.463758196 | 38.958 |
| 1.126616219 | 39.899 |
| 0.993104083 | 40.752 |
| 0.907145937 | 41.43 |
| 0.817899671 | 41.672 |
| 0.80724346 | 42.361 |
| 0.789030232 | 42.815 |
| 0.783799389 | 43.18 |
| 0.792846303 | 43.234 |
| 0.777361213 | 43.289 |
| 0.785339738 | 43.321 |
| 1.457500984 | 38.827 |
| 1.096172393 | 39.364 |
| 0.938558715 | 40.583 |
| 0.86427526 | 41.25 |
| 0.784465839 | 41.532 |
| 0.749539991 | 41.777 |
| 0.74615893 | 42.102 |
| 0.732531344 | 42.516 |
| 0.738655433 | 43.156 |
| 0.726158336 | 43.215 |
| 0.73261878 | 43.266 |
| 1.413242133 | 38.669 |
| 1.071694454 | 39.187 |
| 0.901249245 | 40.407 |
| 0.835501893 | 41.127 |
| 0.743510336 | 41.408 |
| 0.730320188 | 41.692 |
| 0.714768332 | 41.859 |
| 0.704259137 | 42.118 |
| 0.703865308 | 42.502 |
| 0.691322086 | 42.86 |
| 0.696430736 | 43.198 |
| 1.411936276 | 38.588 |
| 1.027117308 | 39.04 |
| 0.880738821 | 39.973 |
| 0.801042341 | 40.972 |
| 0.713847989 | 41.264 |
| 0.701805736 | 41.561 |
| 0.68126343 | 41.777 |
| 0.676478754 | 42.037 |
| 0.676850778 | 42.439 |
| 0.66480913 | 42.504 |
| 0.666281764 | 42.857 |
| 1.410760116 | 38.493 |
| 1.024442657 | 38.919 |
| 0.875174615 | 39.855 |
| 0.785098246 | 40.196 |
| 0.704039519 | 41.135 |
| 0.684961347 | 41.433 |
| 0.664760811 | 41.664 |
| 0.650862865 | 41.964 |
| 0.654441701 | 42.028 |
| 0.638266345 | 42.425 |
| 0.641480094 | 42.5 |
| 4.498770763 | 41.902 |
| 4.01073575 | 42.394 |
| 3.836344388 | 42.545 |
| 3.76314005 | 42.618 |
| 3.714686295 | 42.678 |
| 4.016679479 | 42.767 |
| 4.350974812 | 42.811 |
| 4.535501871 | 42.822 |
| 4.757765786 | 42.825 |
| 4.93408976 | 42.831 |
| 5.136600351 | 42.844 |
| 2.757869277 | 41.631 |
| 2.459947739 | 42.196 |
| 2.204936462 | 42.899 |
| 2.114107553 | 42.908 |
| 2.034258161 | 43.275 |
| 2.072665043 | 43.12 |
| 2.09665229 | 43.45 |
| 2.116943712 | 43.546 |
| 2.104088698 | 43.564 |
| 2.149680776 | 43.572 |
| 2.132220244 | 43.587 |
| 2.080698809 | 40.574 |
| 1.821228471 | 41.965 |
| 1.681293983 | 42.501 |
| 1.609031515 | 43.131 |
| 1.515770461 | 43.261 |
| 1.528792261 | 43.377 |
| 1.534655089 | 43.62 |
| 1.557538954 | 43.66 |
| 1.568848586 | 43.681 |
| 1.585941827 | 43.699 |
| 1.587462124 | 43.715 |
| 1.69945337 | 39.951 |
| 1.54520061 | 40.976 |
| 1.38495795 | 41.662 |
| 1.324054751 | 42.191 |
| 1.232368698 | 42.942 |
| 1.232098734 | 43.25 |
| 1.231737 | 43.349 |
| 1.236238307 | 43.403 |
| 1.244154381 | 43.438 |
| 1.252481098 | 43.462 |
| 1.265547368 | 43.658 |
| 1.581454216 | 39.656 |
| 1.352885225 | 40.69 |
| 1.216413096 | 41.427 |
| 1.137608713 | 41.676 |
| 1.066173472 | 42.183 |
| 1.053997062 | 42.647 |
| 1.048627657 | 43.05 |
| 1.05743194 | 43.303 |
| 1.059214028 | 43.338 |
| 1.066914722 | 43.379 |
| 1.064315382 | 43.41 |
| 1.415710913 | 39.353 |
| 1.266252689 | 40.438 |
| 1.09424963 | 40.916 |
| 1.011484926 | 41.497 |
| 0.946885551 | 41.703 |
| 0.924658517 | 42.223 |
| 0.928709344 | 42.342 |
| 0.917352893 | 43.008 |
| 0.926157467 | 43.243 |
| 0.929701349 | 43.307 |
| 0.935626592 | 43.332 |
| 1.277577194 | 39.209 |
| 1.111031225 | 40.192 |
| 1.007308564 | 40.97 |
| 0.924743016 | 41.578 |
| 0.857715757 | 41.842 |
| 0.84431197 | 42.048 |
| 0.839919429 | 42.514 |
| 0.831830742 | 42.591 |
| 0.83716026 | 42.673 |
| 0.832605928 | 43.179 |
| 0.841558281 | 43.53 |
| 1.277113242 | 39.058 |
| 1.089529222 | 40.009 |
| 0.948691813 | 40.426 |
| 0.877827314 | 41.411 |
| 0.810963293 | 41.651 |
| 0.786218408 | 41.903 |
| 0.78752566 | 42.071 |
| 0.767171881 | 42.177 |
| 0.782043163 | 42.567 |
| 0.770823354 | 42.652 |
| 0.780494544 | 42.998 |
| 1.198034982 | 38.926 |
| 1.054484748 | 39.876 |
| 0.895305302 | 40.009 |
| 0.840899503 | 40.544 |
| 0.764815041 | 41.511 |
| 0.74395467 | 41.737 |
| 0.738163661 | 41.945 |
| 0.729513794 | 42.072 |
| 0.734065988 | 42.155 |
| 0.731097806 | 42.556 |
| 0.734261376 | 42.636 |
| 1.178220229 | 38.789 |
| 1.020072934 | 39.494 |
| 0.878627663 | 39.846 |
| 0.79899926 | 40.422 |
| 0.740335126 | 40.703 |
| 0.712499226 | 41.609 |
| 0.702699133 | 41.795 |
| 0.695343629 | 41.959 |
| 0.698223831 | 42.057 |
| 0.694397679 | 42.46 |
| 0.698101858 | 42.543 |
| 1.171585274 | 38.702 |
| 0.98722652 | 39.362 |
| 0.858270542 | 39.708 |
| 0.783047823 | 40.273 |
| 0.714887529 | 40.534 |
| 0.692152832 | 41.109 |
| 0.675197064 | 41.675 |
| 0.668248522 | 41.836 |
| 0.667866223 | 41.967 |
| 0.66447488 | 42.064 |
| 0.665794987 | 42.151 |
| 1.150946264 | 38.622 |
| 0.985884061 | 39.251 |
| 0.837561109 | 39.371 |
| 0.763456272 | 40.149 |
| 0.69180996 | 40.406 |
| 0.672380067 | 40.951 |
| 0.655456875 | 41.56 |
| 0.64722814 | 41.723 |
| 0.645161893 | 41.833 |
| 0.641566222 | 41.969 |
| 0.639133642 | 42.063 |
| 4.297134616 | 41.959 |
| 4.056604615 | 42.368 |
| 3.781593316 | 42.498 |
| 3.714932689 | 42.595 |
| 3.685541669 | 42.658 |
| 3.971569125 | 42.73 |
| 4.266667932 | 42.791 |
| 4.480653747 | 42.796 |
| 4.738369727 | 42.807 |
| 4.913864695 | 42.809 |
| 5.089460405 | 42.818 |
| 2.811488404 | 41.208 |
| 2.45950247 | 41.946 |
| 2.282480006 | 42.674 |
| 2.126150254 | 42.946 |
| 2.08648229 | 43.23 |
| 2.109209052 | 43.33 |
| 2.11824783 | 43.411 |
| 2.155659367 | 43.434 |
| 2.161311635 | 43.522 |
| 2.188009495 | 43.534 |
| 2.185606511 | 43.556 |
| 2.088405389 | 40.132 |
| 1.90431736 | 41.281 |
| 1.7077877 | 41.525 |
| 1.659133244 | 42.039 |
| 1.536328575 | 42.761 |
| 1.5632235 | 43.017 |
| 1.5444106 | 43.113 |
| 1.588932543 | 43.325 |
| 1.605326717 | 43.355 |
| 1.607653 | 43.373 |
| 1.610197254 | 43.399 |
| 1.695568393 | 40.278 |
| 1.522987089 | 41.196 |
| 1.40736012 | 41.781 |
| 1.349123654 | 42.354 |
| 1.249754751 | 42.537 |
| 1.254748015 | 42.984 |
| 1.246842607 | 43.388 |
| 1.255502847 | 43.589 |
| 1.270809139 | 43.643 |
| 1.272685168 | 43.685 |
| 1.293655118 | 43.875 |
| 1.52520923 | 39.731 |
| 1.355713606 | 40.902 |
| 1.233790436 | 41.247 |
| 1.166253999 | 41.81 |
| 1.075053353 | 42.018 |
| 1.067421557 | 42.492 |
| 1.053074364 | 42.634 |
| 1.070146868 | 43.316 |
| 1.075000442 | 43.375 |
| 1.076358983 | 43.57 |
| 1.084613031 | 43.452 |
| 1.480373338 | 39.509 |
| 1.236920737 | 40.037 |
| 1.134012901 | 41.015 |
| 1.027027307 | 41.613 |
| 0.9744356 | 41.83 |
| 0.936706676 | 42.034 |
| 0.945053276 | 42.487 |
| 0.92520872 | 42.574 |
| 0.943429359 | 42.653 |
| 0.938062792 | 43.04 |
| 0.960762062 | 43.366 |
| 1.415433094 | 39.353 |
| 1.136512794 | 39.824 |
| 1.064034325 | 40.44 |
| 0.95865472 | 40.779 |
| 0.892538323 | 41.667 |
| 0.875690335 | 41.874 |
| 0.861187304 | 42.05 |
| 0.85947504 | 42.137 |
| 0.860566033 | 42.53 |
| 0.857019735 | 42.605 |
| 0.870520387 | 42.668 |
| 1.359245753 | 39.209 |
| 1.102134159 | 39.683 |
| 1.016831405 | 40.008 |
| 0.900524429 | 40.58 |
| 0.85173857 | 41.496 |
| 0.811427495 | 41.711 |
| 0.808511175 | 41.896 |
| 0.792653654 | 42.014 |
| 0.803183893 | 42.115 |
| 0.796692222 | 42.514 |
| 0.805590045 | 42.565 |
| 1.306545487 | 39.078 |
| 1.067569023 | 39.547 |
| 0.950890657 | 39.855 |
| 0.852909496 | 40.385 |
| 0.798330657 | 40.678 |
| 0.750016122 | 41.185 |
| 0.761856681 | 41.743 |
| 0.74046683 | 41.88 |
| 0.749760622 | 41.986 |
| 0.745106403 | 42.089 |
| 0.750035956 | 42.182 |
| 1.262491687 | 38.455 |
| 1.021516339 | 39.413 |
| 0.924749932 | 39.704 |
| 0.823302242 | 40.264 |
| 0.768587338 | 40.53 |
| 0.729062427 | 41.066 |
| 0.727546079 | 41.322 |
| 0.714481712 | 41.75 |
| 0.709587097 | 41.858 |
| 0.711508031 | 41.978 |
| 0.710434486 | 42.07 |
| 1.260660547 | 38.411 |
| 1.000245703 | 39.034 |
| 0.888279372 | 39.589 |
| 0.796557515 | 40.123 |
| 0.735720871 | 40.371 |
| 0.70353406 | 40.61 |
| 0.69161402 | 40.839 |
| 0.687387845 | 41.631 |
| 0.679826075 | 41.753 |
| 0.682850203 | 41.864 |
| 0.677789443 | 41.963 |
| 1.258940484 | 38.34 |
| 0.998883519 | 38.922 |
| 0.887230248 | 39.506 |
| 0.773081738 | 39.756 |
| 0.721936974 | 40.248 |
| 0.689179476 | 40.462 |
| 0.675780932 | 40.696 |
| 0.666519996 | 40.86 |
| 0.656750725 | 41.62 |
| 0.659453739 | 41.757 |
| 0.654932024 | 41.867 |
| 4.644079445 | 41.952 |
| 4.076240039 | 42.327 |
| 3.94439071 | 42.497 |
| 3.845090816 | 42.579 |
| 3.794385 | 42.644 |
| 4.011637518 | 42.718 |
| 4.366028242 | 42.775 |
| 4.583065912 | 42.783 |
| 4.858404441 | 42.796 |
| 4.961650574 | 42.799 |
| 5.164812107 | 42.81 |
| 2.814043254 | 41.177 |
| 2.481950829 | 41.581 |
| 2.23542477 | 42.363 |
| 2.136725996 | 42.66 |
| 2.066798494 | 43.201 |
| 2.086091652 | 43.039 |
| 2.10265546 | 43.384 |
| 2.128576743 | 43.414 |
| 2.152230711 | 43.437 |
| 2.162040245 | 43.51 |
| 2.163711546 | 43.531 |
| 2.099554368 | 40.35 |
| 1.840856857 | 41.172 |
| 1.705361214 | 41.779 |
| 1.628445456 | 42.275 |
| 1.535604573 | 42.991 |
| 1.537488188 | 43.108 |
| 1.540535632 | 43.361 |
| 1.567402027 | 43.404 |
| 1.604141334 | 43.604 |
| 1.601490534 | 43.629 |
| 1.610550401 | 43.654 |
| 1.706597134 | 39.966 |
| 1.565529339 | 40.844 |
| 1.405999485 | 41.478 |
| 1.339190708 | 41.724 |
| 1.245574426 | 42.212 |
| 1.239359494 | 42.356 |
| 1.234939573 | 42.777 |
| 1.244284856 | 43.122 |
| 1.272044286 | 43.18 |
| 1.26189871 | 43.368 |
| 1.287174115 | 43.405 |
| 1.586066028 | 39.684 |
| 1.371815107 | 40.198 |
| 1.239308971 | 40.939 |
| 1.149355184 | 41.475 |
| 1.078882827 | 41.691 |
| 1.059800948 | 41.858 |
| 1.052887392 | 42.308 |
| 1.065061782 | 42.403 |
| 1.078487608 | 42.762 |
| 1.077782865 | 43.103 |
| 1.082473583 | 43.149 |
| 1.441284269 | 39.208 |
| 1.283904862 | 39.708 |
| 1.109258576 | 40.346 |
| 1.023270838 | 41.281 |
| 0.955344247 | 41.489 |
| 0.929778783 | 41.705 |
| 0.930523138 | 42.15 |
| 0.923868435 | 42.247 |
| 0.9414537 | 42.335 |
| 0.941079591 | 42.414 |
| 0.950996792 | 42.748 |
| 1.300871574 | 39.043 |
| 1.129559543 | 39.758 |
| 1.021167641 | 40.382 |
| 0.934471608 | 40.689 |
| 0.863462924 | 41.601 |
| 0.848790842 | 41.796 |
| 0.841582804 | 41.969 |
| 0.83749699 | 42.065 |
| 0.852853601 | 42.476 |
| 0.842441522 | 42.535 |
| 0.854085991 | 42.612 |
| 1.300150661 | 38.915 |
| 1.101447925 | 39.614 |
| 0.963485742 | 40.205 |
| 0.886717344 | 40.511 |
| 0.82047749 | 40.765 |
| 0.790316152 | 41.353 |
| 0.788625701 | 41.816 |
| 0.771946468 | 41.933 |
| 0.796219423 | 42.044 |
| 0.780827844 | 42.447 |
| 0.793092405 | 42.505 |
| 1.220679789 | 38.812 |
| 1.071032617 | 39.471 |
| 0.913908973 | 39.792 |
| 0.850863706 | 40.31 |
| 0.770176119 | 40.606 |
| 0.747597166 | 41.182 |
| 0.742364886 | 41.305 |
| 0.733597065 | 41.8 |
| 0.746029569 | 41.896 |
| 0.738639482 | 42.014 |
| 0.743643792 | 42.412 |
| 1.197230694 | 38.676 |
| 1.033078652 | 39.337 |
| 0.889898752 | 39.66 |
| 0.808184723 | 40.192 |
| 0.744234703 | 40.451 |
| 0.718596599 | 40.682 |
| 0.709719663 | 41.166 |
| 0.699668278 | 41.676 |
| 0.706473634 | 41.776 |
| 0.698321472 | 41.891 |
| 0.705695033 | 41.987 |
| 1.183642948 | 38.623 |
| 0.999407497 | 39.213 |
| 0.872985545 | 39.535 |
| 0.791915133 | 40.042 |
| 0.723059032 | 40.303 |
| 0.695507257 | 40.539 |
| 0.683397437 | 40.735 |
| 0.671697308 | 40.886 |
| 0.678038332 | 41.668 |
| 0.670810218 | 41.777 |
| 0.672886872 | 41.88 |
| 1.168342383 | 38.549 |
| 0.994393177 | 39.121 |
| 0.848666693 | 39.444 |
| 0.773223042 | 39.938 |
| 0.696468155 | 40.175 |
| 0.676591692 | 40.378 |
| 0.658838524 | 40.609 |
| 0.650913699 | 40.774 |
| 0.65476619 | 41.172 |
| 0.64704178 | 41.669 |
| 0.646259516 | 41.768 |
| 4.512739851 | 41.801 |
| 4.128136809 | 42.354 |
| 3.920980478 | 42.436 |
| 3.874887884 | 42.552 |
| 3.721120892 | 42.621 |
| 4.012173067 | 42.728 |
| 4.286931893 | 42.77 |
| 4.556878481 | 42.775 |
| 4.757101253 | 42.787 |
| 4.947967531 | 42.795 |
| 5.144385596 | 42.808 |
| 2.883310619 | 40.906 |
| 2.555633157 | 41.915 |
| 2.283459194 | 42.115 |
| 2.167264738 | 42.474 |
| 2.069067099 | 42.911 |
| 2.120476103 | 43.038 |
| 2.138741438 | 43.108 |
| 2.159816799 | 43.135 |
| 2.160943036 | 43.232 |
| 2.196687488 | 43.234 |
| 2.195954457 | 43.263 |
| 2.215830838 | 40.328 |
| 2.030389221 | 41.101 |
| 1.741495444 | 42.068 |
| 1.644428053 | 42.249 |
| 1.54909646 | 42.949 |
| 1.594122867 | 43.106 |
| 1.550212821 | 43.185 |
| 1.608144062 | 43.562 |
| 1.58809458 | 43.586 |
| 1.626743667 | 43.605 |
| 1.616475789 | 43.642 |
| 1.946501552 | 39.941 |
| 1.71515054 | 40.753 |
| 1.482243294 | 41.462 |
| 1.392922454 | 41.677 |
| 1.275162968 | 42.167 |
| 1.288731956 | 42.342 |
| 1.265851443 | 42.757 |
| 1.278393365 | 43.111 |
| 1.284872988 | 43.162 |
| 1.287752846 | 43.198 |
| 1.3052301 | 43.394 |
| 1.704062723 | 39.65 |
| 1.464514111 | 40.148 |
| 1.272167676 | 40.839 |
| 1.168871073 | 41.442 |
| 1.079937677 | 41.622 |
| 1.091653588 | 42.146 |
| 1.063732471 | 42.293 |
| 1.085623826 | 42.38 |
| 1.07763828 | 42.444 |
| 1.090137433 | 42.797 |
| 1.084187037 | 43.125 |
| 1.643498149 | 38.899 |
| 1.329732947 | 39.917 |
| 1.144090736 | 40.309 |
| 1.041864128 | 40.58 |
| 0.97491805 | 41.43 |
| 0.961807454 | 41.672 |
| 0.946365336 | 42.117 |
| 0.949227597 | 42.224 |
| 0.949384874 | 42.318 |
| 0.956975746 | 42.386 |
| 0.960300472 | 42.724 |
| 1.562319294 | 38.765 |
| 1.211471021 | 39.422 |
| 1.048062227 | 40.091 |
| 0.963209985 | 40.396 |
| 0.886205872 | 41.26 |
| 0.889507226 | 41.501 |
| 0.855572883 | 41.674 |
| 0.866733114 | 41.763 |
| 0.859699501 | 42.188 |
| 0.859079783 | 42.245 |
| 0.863230529 | 42.305 |
| 1.474412414 | 38.645 |
| 1.152665864 | 39.293 |
| 1.005127682 | 39.917 |
| 0.895379087 | 40.198 |
| 0.837352141 | 40.439 |
| 0.820429501 | 40.975 |
| 0.805141631 | 41.526 |
| 0.798170754 | 41.643 |
| 0.803294066 | 41.741 |
| 0.794813293 | 42.145 |
| 0.802862311 | 42.203 |
| 1.476111844 | 38.536 |
| 1.121370838 | 39.144 |
| 0.951494375 | 39.745 |
| 0.850924701 | 40.015 |
| 0.787638529 | 40.269 |
| 0.763017374 | 40.518 |
| 0.757058452 | 41.001 |
| 0.745484481 | 41.51 |
| 0.749811324 | 41.613 |
| 0.741861295 | 41.708 |
| 0.749759538 | 42.104 |
| 1.431013006 | 38.405 |
| 1.095990519 | 39.026 |
| 0.917820827 | 39.341 |
| 0.830286051 | 39.889 |
| 0.754531619 | 40.107 |
| 0.745181194 | 40.392 |
| 0.721133709 | 40.578 |
| 0.71703424 | 41.371 |
| 0.711568659 | 41.492 |
| 0.704141195 | 41.584 |
| 0.707625975 | 41.676 |
| 1.431485997 | 38.334 |
| 1.051164123 | 38.674 |
| 0.854344443 | 39.217 |
| 0.794572137 | 39.739 |
| 0.733230075 | 39.976 |
| 0.718270404 | 40.228 |
| 0.694506913 | 40.458 |
| 0.688307129 | 40.59 |
| 0.682306358 | 41.375 |
| 0.678268255 | 41.482 |
| 0.679062697 | 41.571 |
| 1.432000561 | 38.247 |
| 1.052019874 | 38.584 |
| 0.862552206 | 39.116 |
| 0.78304455 | 39.629 |
| 0.719375586 | 39.843 |
| 0.70230327 | 40.092 |
| 0.674732046 | 40.32 |
| 0.663895359 | 40.488 |
| 0.662847201 | 40.587 |
| 0.654828207 | 40.998 |
| 0.655197502 | 41.468 |